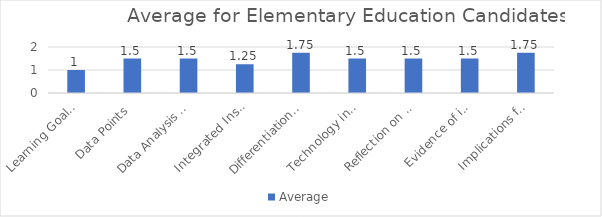
| Category | Average |
|---|---|
| Learning Goals Aligned with Pre-/Post-assessments ACEI 4.0 | 1 |
| Data Points | 1.5 |
| Data Analysis for Pedagogical Decisions ACEI 4.0 | 1.5 |
| Integrated Instruction ACEI 3.1 | 1.25 |
| Differentiation based on knowledge of individual learning ACEI 3.2 | 1.75 |
| Technology integration | 1.5 |
| Reflection on pedagogical decisions ACEI 1.0 | 1.5 |
| Evidence of impact on student learning ACEI 5.1 | 1.5 |
| Implications for teaching and professional development ACEI 5.1 | 1.75 |